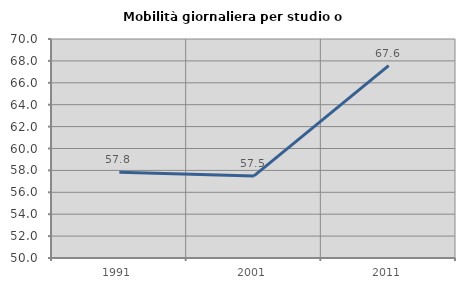
| Category | Mobilità giornaliera per studio o lavoro |
|---|---|
| 1991.0 | 57.82 |
| 2001.0 | 57.498 |
| 2011.0 | 67.563 |